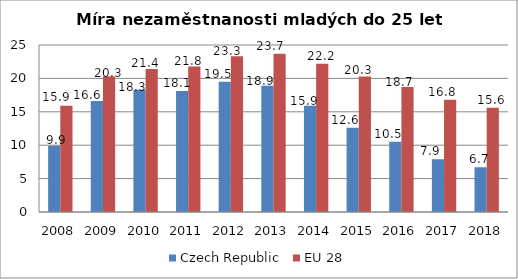
| Category | Czech Republic | EU 28 |
|---|---|---|
| 2008 | 9.9 | 15.9 |
| 2009 | 16.6 | 20.3 |
| 2010 | 18.3 | 21.4 |
| 2011 | 18.1 | 21.8 |
| 2012 | 19.5 | 23.3 |
| 2013 | 18.9 | 23.7 |
| 2014 | 15.9 | 22.2 |
| 2015 | 12.6 | 20.3 |
| 2016 | 10.5 | 18.7 |
| 2017 | 7.9 | 16.8 |
| 2018 | 6.7 | 15.6 |